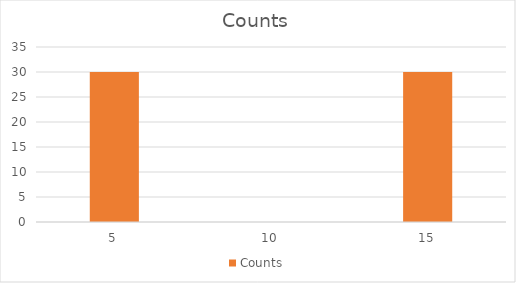
| Category | Counts |
|---|---|
| 5.0 | 30 |
| 10.0 | 0 |
| 15.0 | 30 |